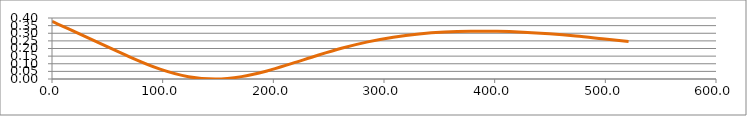
| Category | Series 0 |
|---|---|
| 0.0 | 0.378 |
| 70.0341 | 0.145 |
| 97.6131 | 0.065 |
| 123.333 | 0.015 |
| 147.722 | 0 |
| 171.233 | 0.016 |
| 194.226 | 0.053 |
| 216.973 | 0.102 |
| 239.664 | 0.154 |
| 262.421 | 0.203 |
| 285.312 | 0.243 |
| 308.367 | 0.274 |
| 331.59 | 0.296 |
| 354.966 | 0.308 |
| 378.474 | 0.313 |
| 402.088 | 0.312 |
| 425.782 | 0.307 |
| 449.536 | 0.297 |
| 473.33 | 0.282 |
| 497.153 | 0.264 |
| 520.997 | 0.245 |